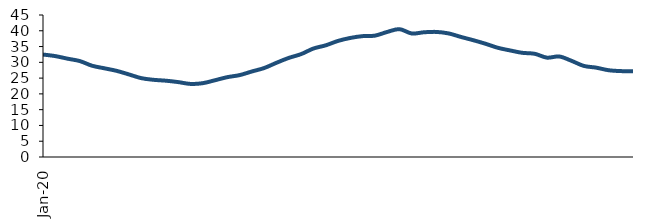
| Category | Series 0 |
|---|---|
| 2020-01-01 | 32.469 |
| 2020-02-01 | 31.976 |
| 2020-03-01 | 31.156 |
| 2020-04-01 | 30.392 |
| 2020-05-01 | 28.913 |
| 2020-06-01 | 28.108 |
| 2020-07-01 | 27.29 |
| 2020-08-01 | 26.155 |
| 2020-09-01 | 24.984 |
| 2020-10-01 | 24.457 |
| 2020-11-01 | 24.181 |
| 2020-12-01 | 23.74 |
| 2021-01-01 | 23.158 |
| 2021-02-01 | 23.396 |
| 2021-03-01 | 24.331 |
| 2021-04-01 | 25.306 |
| 2021-05-01 | 25.953 |
| 2021-06-01 | 27.111 |
| 2021-07-01 | 28.2 |
| 2021-08-01 | 29.868 |
| 2021-09-01 | 31.404 |
| 2021-10-01 | 32.611 |
| 2021-11-01 | 34.373 |
| 2021-12-01 | 35.387 |
| 2022-01-01 | 36.784 |
| 2022-02-01 | 37.727 |
| 2022-03-01 | 38.303 |
| 2022-04-01 | 38.455 |
| 2022-05-01 | 39.626 |
| 2022-06-01 | 40.515 |
| 2022-07-01 | 39.14 |
| 2022-08-01 | 39.529 |
| 2022-09-01 | 39.638 |
| 2022-10-01 | 39.158 |
| 2022-11-01 | 38.048 |
| 2022-12-01 | 37.019 |
| 2023-01-01 | 35.89 |
| 2023-02-01 | 34.611 |
| 2023-03-01 | 33.773 |
| 2023-04-01 | 33.011 |
| 2023-05-01 | 32.711 |
| 2023-06-01 | 31.485 |
| 2023-07-01 | 31.855 |
| 2023-08-01 | 30.473 |
| 2023-09-01 | 28.864 |
| 2023-10-01 | 28.318 |
| 2023-11-01 | 27.504 |
| 2023-12-01 | 27.222 |
| 2024-01-01 | 27.2 |